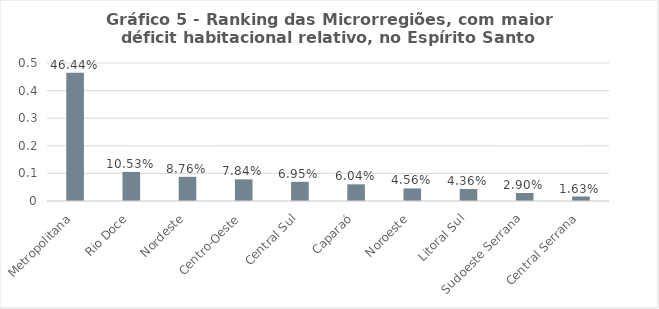
| Category | Series 0 |
|---|---|
| Metropolitana | 0.464 |
| Rio Doce | 0.105 |
| Nordeste | 0.088 |
| Centro-Oeste | 0.078 |
| Central Sul | 0.07 |
| Caparaó | 0.06 |
| Noroeste | 0.046 |
| Litoral Sul | 0.044 |
| Sudoeste Serrana | 0.029 |
| Central Serrana | 0.016 |